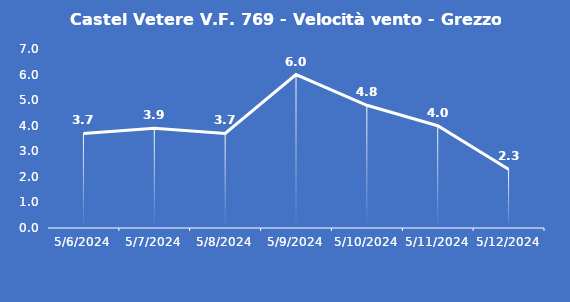
| Category | Castel Vetere V.F. 769 - Velocità vento - Grezzo (m/s) |
|---|---|
| 5/6/24 | 3.7 |
| 5/7/24 | 3.9 |
| 5/8/24 | 3.7 |
| 5/9/24 | 6 |
| 5/10/24 | 4.8 |
| 5/11/24 | 4 |
| 5/12/24 | 2.3 |